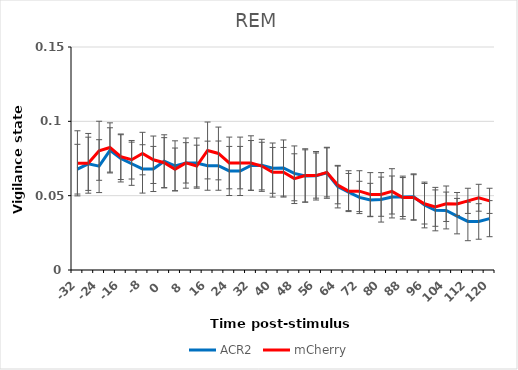
| Category | ACR2 | mCherry |
|---|---|---|
| -32.0 | 0.068 | 0.072 |
| -28.0 | 0.071 | 0.072 |
| -24.0 | 0.07 | 0.08 |
| -20.0 | 0.08 | 0.082 |
| -16.0 | 0.075 | 0.076 |
| -12.0 | 0.071 | 0.074 |
| -8.0 | 0.068 | 0.078 |
| -4.0 | 0.068 | 0.074 |
| 0.0 | 0.073 | 0.072 |
| 4.0 | 0.07 | 0.068 |
| 8.0 | 0.072 | 0.072 |
| 12.0 | 0.072 | 0.07 |
| 16.0 | 0.07 | 0.08 |
| 20.0 | 0.07 | 0.078 |
| 24.0 | 0.067 | 0.072 |
| 28.0 | 0.067 | 0.072 |
| 32.0 | 0.07 | 0.072 |
| 36.0 | 0.07 | 0.07 |
| 40.0 | 0.069 | 0.066 |
| 44.0 | 0.069 | 0.066 |
| 48.0 | 0.065 | 0.061 |
| 52.0 | 0.063 | 0.064 |
| 56.0 | 0.063 | 0.064 |
| 60.0 | 0.065 | 0.066 |
| 64.0 | 0.056 | 0.057 |
| 68.0 | 0.052 | 0.053 |
| 72.0 | 0.049 | 0.053 |
| 76.0 | 0.047 | 0.051 |
| 80.0 | 0.047 | 0.051 |
| 84.0 | 0.049 | 0.053 |
| 88.0 | 0.049 | 0.049 |
| 92.0 | 0.049 | 0.049 |
| 96.0 | 0.044 | 0.045 |
| 100.0 | 0.04 | 0.042 |
| 104.0 | 0.04 | 0.045 |
| 108.0 | 0.036 | 0.044 |
| 112.0 | 0.033 | 0.047 |
| 116.0 | 0.033 | 0.049 |
| 120.0 | 0.035 | 0.047 |